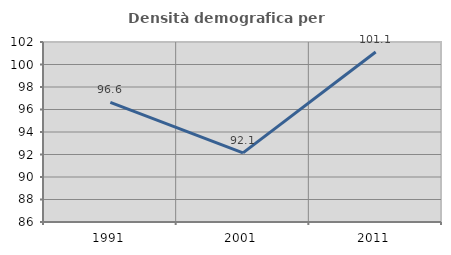
| Category | Densità demografica |
|---|---|
| 1991.0 | 96.626 |
| 2001.0 | 92.143 |
| 2011.0 | 101.108 |